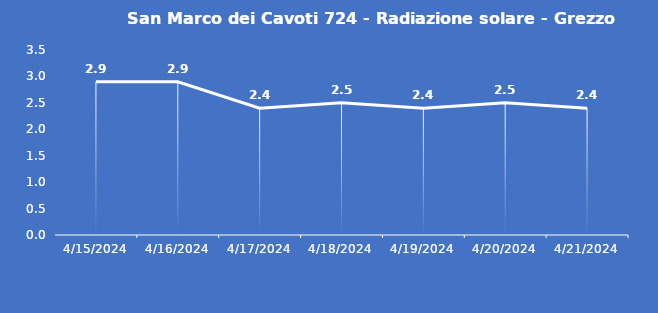
| Category | San Marco dei Cavoti 724 - Radiazione solare - Grezzo (W/m2) |
|---|---|
| 4/15/24 | 2.9 |
| 4/16/24 | 2.9 |
| 4/17/24 | 2.4 |
| 4/18/24 | 2.5 |
| 4/19/24 | 2.4 |
| 4/20/24 | 2.5 |
| 4/21/24 | 2.4 |